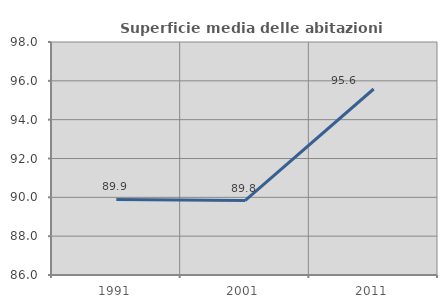
| Category | Superficie media delle abitazioni occupate |
|---|---|
| 1991.0 | 89.891 |
| 2001.0 | 89.835 |
| 2011.0 | 95.58 |